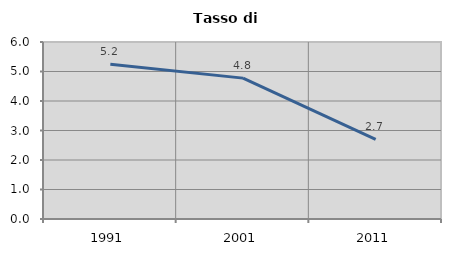
| Category | Tasso di disoccupazione   |
|---|---|
| 1991.0 | 5.249 |
| 2001.0 | 4.775 |
| 2011.0 | 2.695 |